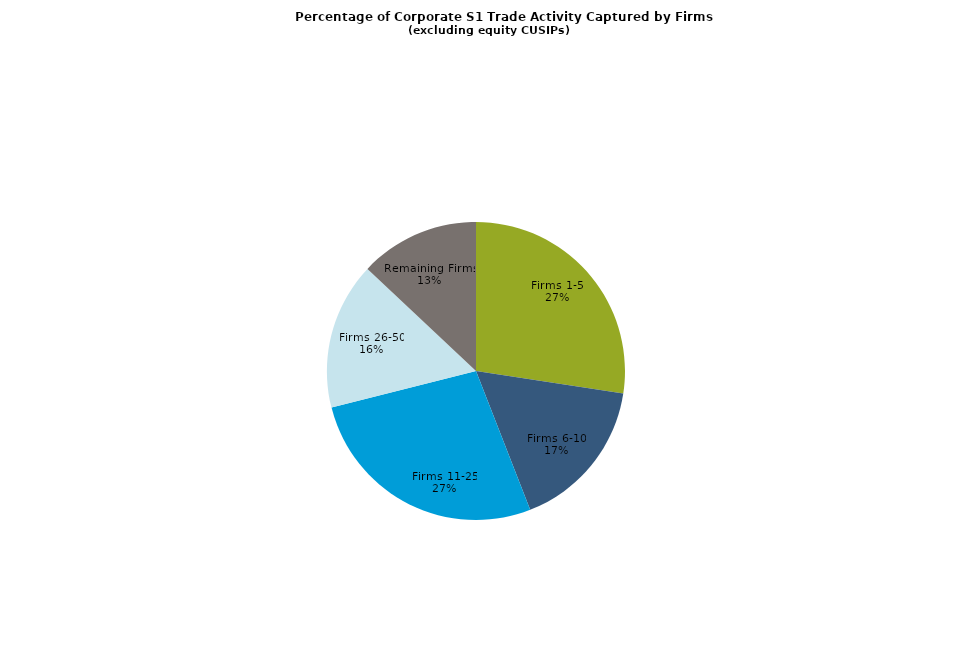
| Category | Series 0 |
|---|---|
| Firms 1-5 | 0.274 |
| Firms 6-10 | 0.167 |
| Firms 11-25 | 0.27 |
| Firms 26-50 | 0.16 |
| Remaining Firms | 0.13 |